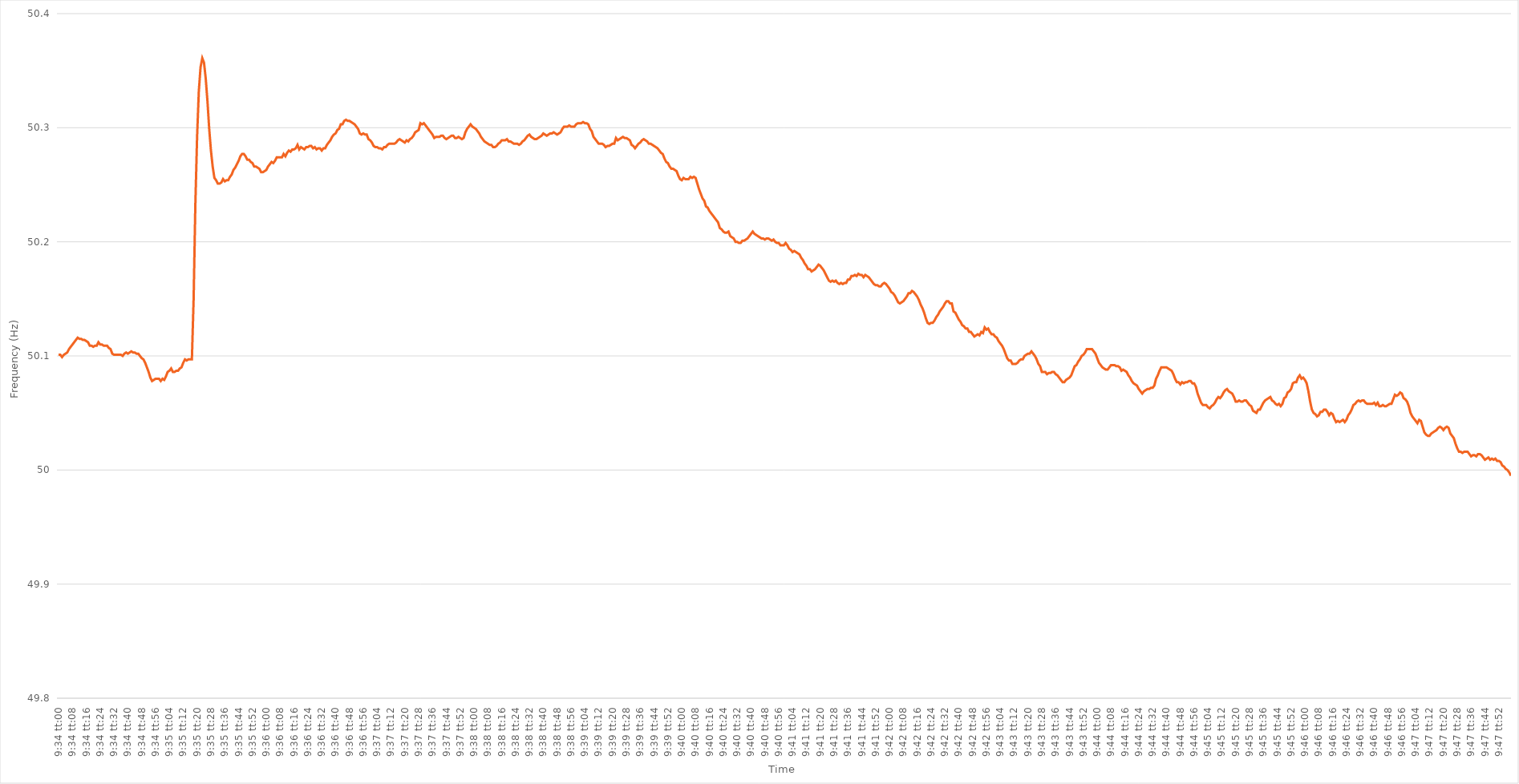
| Category | Series 0 |
|---|---|
| 0.3986111111111111 | 50.101 |
| 0.39862268518518523 | 50.101 |
| 0.39863425925925927 | 50.099 |
| 0.39864583333333337 | 50.101 |
| 0.3986574074074074 | 50.102 |
| 0.3986689814814815 | 50.103 |
| 0.39868055555555554 | 50.106 |
| 0.3986921296296296 | 50.108 |
| 0.3987037037037037 | 50.11 |
| 0.39871527777777777 | 50.112 |
| 0.39872685185185186 | 50.114 |
| 0.3987384259259259 | 50.116 |
| 0.39875 | 50.115 |
| 0.39876157407407403 | 50.115 |
| 0.3987731481481482 | 50.114 |
| 0.3987847222222222 | 50.114 |
| 0.3987962962962963 | 50.113 |
| 0.39880787037037035 | 50.112 |
| 0.39881944444444445 | 50.109 |
| 0.3988310185185185 | 50.109 |
| 0.39884259259259264 | 50.108 |
| 0.3988541666666667 | 50.109 |
| 0.39886574074074077 | 50.109 |
| 0.3988773148148148 | 50.112 |
| 0.3988888888888889 | 50.11 |
| 0.39890046296296294 | 50.11 |
| 0.398912037037037 | 50.109 |
| 0.39892361111111113 | 50.109 |
| 0.39893518518518517 | 50.109 |
| 0.39894675925925926 | 50.107 |
| 0.3989583333333333 | 50.106 |
| 0.3989699074074074 | 50.102 |
| 0.39898148148148144 | 50.101 |
| 0.3989930555555556 | 50.101 |
| 0.3990046296296296 | 50.101 |
| 0.3990162037037037 | 50.101 |
| 0.39902777777777776 | 50.101 |
| 0.39903935185185185 | 50.1 |
| 0.3990509259259259 | 50.102 |
| 0.39906250000000004 | 50.103 |
| 0.3990740740740741 | 50.102 |
| 0.3990856481481482 | 50.103 |
| 0.3990972222222222 | 50.104 |
| 0.3991087962962963 | 50.103 |
| 0.39912037037037035 | 50.103 |
| 0.3991319444444445 | 50.102 |
| 0.39914351851851854 | 50.102 |
| 0.3991550925925926 | 50.1 |
| 0.39916666666666667 | 50.098 |
| 0.3991782407407407 | 50.097 |
| 0.3991898148148148 | 50.094 |
| 0.39920138888888884 | 50.09 |
| 0.399212962962963 | 50.086 |
| 0.39922453703703703 | 50.081 |
| 0.3992361111111111 | 50.078 |
| 0.39924768518518516 | 50.079 |
| 0.39925925925925926 | 50.08 |
| 0.3992708333333333 | 50.08 |
| 0.39928240740740745 | 50.08 |
| 0.3992939814814815 | 50.078 |
| 0.3993055555555556 | 50.08 |
| 0.3993171296296296 | 50.079 |
| 0.3993287037037037 | 50.082 |
| 0.39934027777777775 | 50.086 |
| 0.3993518518518519 | 50.087 |
| 0.39936342592592594 | 50.089 |
| 0.39937500000000004 | 50.086 |
| 0.3993865740740741 | 50.086 |
| 0.3993981481481481 | 50.087 |
| 0.3994097222222222 | 50.087 |
| 0.39942129629629625 | 50.089 |
| 0.3994328703703704 | 50.09 |
| 0.39944444444444444 | 50.094 |
| 0.39945601851851853 | 50.097 |
| 0.39946759259259257 | 50.096 |
| 0.39947916666666666 | 50.097 |
| 0.3994907407407407 | 50.097 |
| 0.39950231481481485 | 50.097 |
| 0.3995138888888889 | 50.15 |
| 0.399525462962963 | 50.233 |
| 0.399537037037037 | 50.292 |
| 0.3995486111111111 | 50.332 |
| 0.39956018518518516 | 50.353 |
| 0.3995717592592593 | 50.361 |
| 0.39958333333333335 | 50.357 |
| 0.39959490740740744 | 50.343 |
| 0.3996064814814815 | 50.323 |
| 0.3996180555555556 | 50.299 |
| 0.3996296296296296 | 50.28 |
| 0.39964120370370365 | 50.266 |
| 0.3996527777777778 | 50.256 |
| 0.39966435185185184 | 50.254 |
| 0.39967592592592593 | 50.251 |
| 0.3996875 | 50.251 |
| 0.39969907407407407 | 50.252 |
| 0.3997106481481481 | 50.255 |
| 0.39972222222222226 | 50.253 |
| 0.3997337962962963 | 50.254 |
| 0.3997453703703704 | 50.254 |
| 0.39975694444444443 | 50.257 |
| 0.3997685185185185 | 50.259 |
| 0.39978009259259256 | 50.263 |
| 0.3997916666666667 | 50.265 |
| 0.39980324074074075 | 50.268 |
| 0.39981481481481485 | 50.271 |
| 0.3998263888888889 | 50.275 |
| 0.399837962962963 | 50.277 |
| 0.399849537037037 | 50.277 |
| 0.39986111111111106 | 50.275 |
| 0.3998726851851852 | 50.272 |
| 0.39988425925925924 | 50.272 |
| 0.39989583333333334 | 50.27 |
| 0.3999074074074074 | 50.269 |
| 0.3999189814814815 | 50.266 |
| 0.3999305555555555 | 50.266 |
| 0.39994212962962966 | 50.265 |
| 0.3999537037037037 | 50.264 |
| 0.3999652777777778 | 50.261 |
| 0.39997685185185183 | 50.261 |
| 0.39998842592592593 | 50.262 |
| 0.39999999999999997 | 50.263 |
| 0.4000115740740741 | 50.266 |
| 0.40002314814814816 | 50.268 |
| 0.40003472222222225 | 50.27 |
| 0.4000462962962963 | 50.269 |
| 0.4000578703703704 | 50.271 |
| 0.4000694444444444 | 50.274 |
| 0.40008101851851857 | 50.274 |
| 0.4000925925925926 | 50.274 |
| 0.40010416666666665 | 50.274 |
| 0.40011574074074074 | 50.277 |
| 0.4001273148148148 | 50.275 |
| 0.4001388888888889 | 50.278 |
| 0.4001504629629629 | 50.28 |
| 0.40016203703703707 | 50.279 |
| 0.4001736111111111 | 50.281 |
| 0.4001851851851852 | 50.281 |
| 0.40019675925925924 | 50.282 |
| 0.40020833333333333 | 50.285 |
| 0.40021990740740737 | 50.281 |
| 0.4002314814814815 | 50.283 |
| 0.40024305555555556 | 50.282 |
| 0.40025462962962965 | 50.281 |
| 0.4002662037037037 | 50.283 |
| 0.4002777777777778 | 50.283 |
| 0.4002893518518518 | 50.284 |
| 0.400300925925926 | 50.284 |
| 0.4003125 | 50.282 |
| 0.4003240740740741 | 50.283 |
| 0.40033564814814815 | 50.281 |
| 0.4003472222222222 | 50.282 |
| 0.4003587962962963 | 50.282 |
| 0.4003703703703703 | 50.28 |
| 0.40038194444444447 | 50.282 |
| 0.4003935185185185 | 50.282 |
| 0.4004050925925926 | 50.285 |
| 0.40041666666666664 | 50.287 |
| 0.40042824074074074 | 50.289 |
| 0.4004398148148148 | 50.292 |
| 0.4004513888888889 | 50.294 |
| 0.40046296296296297 | 50.295 |
| 0.40047453703703706 | 50.298 |
| 0.4004861111111111 | 50.299 |
| 0.4004976851851852 | 50.303 |
| 0.40050925925925923 | 50.303 |
| 0.4005208333333334 | 50.306 |
| 0.4005324074074074 | 50.307 |
| 0.4005439814814815 | 50.306 |
| 0.40055555555555555 | 50.306 |
| 0.40056712962962965 | 50.305 |
| 0.4005787037037037 | 50.304 |
| 0.4005902777777777 | 50.303 |
| 0.4006018518518519 | 50.301 |
| 0.4006134259259259 | 50.299 |
| 0.400625 | 50.295 |
| 0.40063657407407405 | 50.294 |
| 0.40064814814814814 | 50.295 |
| 0.4006597222222222 | 50.294 |
| 0.40067129629629633 | 50.294 |
| 0.40068287037037037 | 50.29 |
| 0.40069444444444446 | 50.289 |
| 0.4007060185185185 | 50.287 |
| 0.4007175925925926 | 50.284 |
| 0.40072916666666664 | 50.283 |
| 0.4007407407407408 | 50.283 |
| 0.4007523148148148 | 50.282 |
| 0.4007638888888889 | 50.282 |
| 0.40077546296296296 | 50.281 |
| 0.40078703703703705 | 50.283 |
| 0.4007986111111111 | 50.283 |
| 0.40081018518518513 | 50.285 |
| 0.4008217592592593 | 50.286 |
| 0.4008333333333333 | 50.286 |
| 0.4008449074074074 | 50.286 |
| 0.40085648148148145 | 50.286 |
| 0.40086805555555555 | 50.287 |
| 0.4008796296296296 | 50.289 |
| 0.40089120370370374 | 50.29 |
| 0.4009027777777778 | 50.289 |
| 0.40091435185185187 | 50.288 |
| 0.4009259259259259 | 50.287 |
| 0.4009375 | 50.289 |
| 0.40094907407407404 | 50.288 |
| 0.4009606481481482 | 50.29 |
| 0.40097222222222223 | 50.291 |
| 0.4009837962962963 | 50.293 |
| 0.40099537037037036 | 50.296 |
| 0.40100694444444446 | 50.297 |
| 0.4010185185185185 | 50.298 |
| 0.40103009259259265 | 50.304 |
| 0.4010416666666667 | 50.303 |
| 0.4010532407407407 | 50.304 |
| 0.4010648148148148 | 50.302 |
| 0.40107638888888886 | 50.3 |
| 0.40108796296296295 | 50.298 |
| 0.401099537037037 | 50.296 |
| 0.40111111111111114 | 50.294 |
| 0.4011226851851852 | 50.291 |
| 0.4011342592592593 | 50.292 |
| 0.4011458333333333 | 50.292 |
| 0.4011574074074074 | 50.292 |
| 0.40116898148148145 | 50.293 |
| 0.4011805555555556 | 50.293 |
| 0.40119212962962963 | 50.291 |
| 0.40120370370370373 | 50.29 |
| 0.40121527777777777 | 50.291 |
| 0.40122685185185186 | 50.292 |
| 0.4012384259259259 | 50.293 |
| 0.40125000000000005 | 50.293 |
| 0.4012615740740741 | 50.291 |
| 0.4012731481481482 | 50.291 |
| 0.4012847222222222 | 50.292 |
| 0.40129629629629626 | 50.291 |
| 0.40130787037037036 | 50.29 |
| 0.4013194444444444 | 50.291 |
| 0.40133101851851855 | 50.296 |
| 0.4013425925925926 | 50.299 |
| 0.4013541666666667 | 50.301 |
| 0.4013657407407407 | 50.303 |
| 0.4013773148148148 | 50.301 |
| 0.40138888888888885 | 50.3 |
| 0.401400462962963 | 50.299 |
| 0.40141203703703704 | 50.297 |
| 0.40142361111111113 | 50.295 |
| 0.4014351851851852 | 50.292 |
| 0.40144675925925927 | 50.29 |
| 0.4014583333333333 | 50.288 |
| 0.40146990740740746 | 50.287 |
| 0.4014814814814815 | 50.286 |
| 0.4014930555555556 | 50.285 |
| 0.40150462962962963 | 50.285 |
| 0.40151620370370367 | 50.283 |
| 0.40152777777777776 | 50.283 |
| 0.4015393518518518 | 50.284 |
| 0.40155092592592595 | 50.286 |
| 0.4015625 | 50.287 |
| 0.4015740740740741 | 50.289 |
| 0.4015856481481481 | 50.289 |
| 0.4015972222222222 | 50.289 |
| 0.40160879629629626 | 50.29 |
| 0.4016203703703704 | 50.288 |
| 0.40163194444444444 | 50.288 |
| 0.40164351851851854 | 50.287 |
| 0.4016550925925926 | 50.286 |
| 0.40166666666666667 | 50.286 |
| 0.4016782407407407 | 50.286 |
| 0.40168981481481486 | 50.285 |
| 0.4017013888888889 | 50.286 |
| 0.401712962962963 | 50.288 |
| 0.40172453703703703 | 50.289 |
| 0.4017361111111111 | 50.291 |
| 0.40174768518518517 | 50.293 |
| 0.4017592592592592 | 50.294 |
| 0.40177083333333335 | 50.292 |
| 0.4017824074074074 | 50.291 |
| 0.4017939814814815 | 50.29 |
| 0.4018055555555555 | 50.29 |
| 0.4018171296296296 | 50.291 |
| 0.40182870370370366 | 50.292 |
| 0.4018402777777778 | 50.293 |
| 0.40185185185185185 | 50.295 |
| 0.40186342592592594 | 50.294 |
| 0.401875 | 50.293 |
| 0.4018865740740741 | 50.294 |
| 0.4018981481481481 | 50.295 |
| 0.40190972222222227 | 50.295 |
| 0.4019212962962963 | 50.296 |
| 0.4019328703703704 | 50.295 |
| 0.40194444444444444 | 50.294 |
| 0.40195601851851853 | 50.295 |
| 0.40196759259259257 | 50.296 |
| 0.4019791666666667 | 50.299 |
| 0.40199074074074076 | 50.301 |
| 0.4020023148148148 | 50.301 |
| 0.4020138888888889 | 50.301 |
| 0.40202546296296293 | 50.302 |
| 0.402037037037037 | 50.301 |
| 0.40204861111111106 | 50.301 |
| 0.4020601851851852 | 50.301 |
| 0.40207175925925925 | 50.303 |
| 0.40208333333333335 | 50.304 |
| 0.4020949074074074 | 50.304 |
| 0.4021064814814815 | 50.304 |
| 0.4021180555555555 | 50.305 |
| 0.40212962962962967 | 50.304 |
| 0.4021412037037037 | 50.304 |
| 0.4021527777777778 | 50.303 |
| 0.40216435185185184 | 50.299 |
| 0.40217592592592594 | 50.297 |
| 0.4021875 | 50.292 |
| 0.4021990740740741 | 50.29 |
| 0.40221064814814816 | 50.288 |
| 0.40222222222222226 | 50.286 |
| 0.4022337962962963 | 50.286 |
| 0.40224537037037034 | 50.286 |
| 0.40225694444444443 | 50.285 |
| 0.40226851851851847 | 50.283 |
| 0.4022800925925926 | 50.284 |
| 0.40229166666666666 | 50.284 |
| 0.40230324074074075 | 50.285 |
| 0.4023148148148148 | 50.286 |
| 0.4023263888888889 | 50.286 |
| 0.4023379629629629 | 50.291 |
| 0.4023495370370371 | 50.289 |
| 0.4023611111111111 | 50.29 |
| 0.4023726851851852 | 50.291 |
| 0.40238425925925925 | 50.292 |
| 0.40239583333333334 | 50.291 |
| 0.4024074074074074 | 50.291 |
| 0.40241898148148153 | 50.29 |
| 0.40243055555555557 | 50.289 |
| 0.40244212962962966 | 50.285 |
| 0.4024537037037037 | 50.284 |
| 0.40246527777777774 | 50.282 |
| 0.40247685185185184 | 50.284 |
| 0.4024884259259259 | 50.286 |
| 0.4025 | 50.287 |
| 0.40251157407407406 | 50.289 |
| 0.40252314814814816 | 50.29 |
| 0.4025347222222222 | 50.289 |
| 0.4025462962962963 | 50.288 |
| 0.40255787037037033 | 50.286 |
| 0.4025694444444445 | 50.286 |
| 0.4025810185185185 | 50.285 |
| 0.4025925925925926 | 50.284 |
| 0.40260416666666665 | 50.283 |
| 0.40261574074074075 | 50.282 |
| 0.4026273148148148 | 50.28 |
| 0.40263888888888894 | 50.278 |
| 0.402650462962963 | 50.277 |
| 0.40266203703703707 | 50.273 |
| 0.4026736111111111 | 50.27 |
| 0.4026851851851852 | 50.269 |
| 0.40269675925925924 | 50.266 |
| 0.4027083333333333 | 50.264 |
| 0.40271990740740743 | 50.264 |
| 0.40273148148148147 | 50.263 |
| 0.40274305555555556 | 50.262 |
| 0.4027546296296296 | 50.258 |
| 0.4027662037037037 | 50.255 |
| 0.40277777777777773 | 50.254 |
| 0.4027893518518519 | 50.256 |
| 0.4028009259259259 | 50.255 |
| 0.4028125 | 50.255 |
| 0.40282407407407406 | 50.255 |
| 0.40283564814814815 | 50.257 |
| 0.4028472222222222 | 50.256 |
| 0.40285879629629634 | 50.257 |
| 0.4028703703703704 | 50.256 |
| 0.4028819444444445 | 50.251 |
| 0.4028935185185185 | 50.246 |
| 0.4029050925925926 | 50.242 |
| 0.40291666666666665 | 50.238 |
| 0.4029282407407408 | 50.236 |
| 0.40293981481481483 | 50.231 |
| 0.4029513888888889 | 50.23 |
| 0.40296296296296297 | 50.227 |
| 0.402974537037037 | 50.225 |
| 0.4029861111111111 | 50.223 |
| 0.40299768518518514 | 50.221 |
| 0.4030092592592593 | 50.219 |
| 0.40302083333333333 | 50.217 |
| 0.4030324074074074 | 50.212 |
| 0.40304398148148146 | 50.211 |
| 0.40305555555555556 | 50.209 |
| 0.4030671296296296 | 50.208 |
| 0.40307870370370374 | 50.208 |
| 0.4030902777777778 | 50.209 |
| 0.4031018518518519 | 50.205 |
| 0.4031134259259259 | 50.204 |
| 0.403125 | 50.203 |
| 0.40313657407407405 | 50.2 |
| 0.4031481481481482 | 50.2 |
| 0.40315972222222224 | 50.199 |
| 0.40317129629629633 | 50.199 |
| 0.40318287037037037 | 50.201 |
| 0.4031944444444444 | 50.201 |
| 0.4032060185185185 | 50.202 |
| 0.40321759259259254 | 50.203 |
| 0.4032291666666667 | 50.205 |
| 0.40324074074074073 | 50.207 |
| 0.4032523148148148 | 50.209 |
| 0.40326388888888887 | 50.207 |
| 0.40327546296296296 | 50.206 |
| 0.403287037037037 | 50.205 |
| 0.40329861111111115 | 50.204 |
| 0.4033101851851852 | 50.203 |
| 0.4033217592592593 | 50.203 |
| 0.4033333333333333 | 50.202 |
| 0.4033449074074074 | 50.203 |
| 0.40335648148148145 | 50.203 |
| 0.4033680555555556 | 50.202 |
| 0.40337962962962964 | 50.201 |
| 0.40339120370370374 | 50.202 |
| 0.4034027777777778 | 50.2 |
| 0.4034143518518518 | 50.199 |
| 0.4034259259259259 | 50.199 |
| 0.40343749999999995 | 50.197 |
| 0.4034490740740741 | 50.197 |
| 0.40346064814814814 | 50.197 |
| 0.40347222222222223 | 50.199 |
| 0.40348379629629627 | 50.197 |
| 0.40349537037037037 | 50.194 |
| 0.4035069444444444 | 50.193 |
| 0.40351851851851855 | 50.191 |
| 0.4035300925925926 | 50.192 |
| 0.4035416666666667 | 50.191 |
| 0.4035532407407407 | 50.19 |
| 0.4035648148148148 | 50.189 |
| 0.40357638888888886 | 50.186 |
| 0.403587962962963 | 50.184 |
| 0.40359953703703705 | 50.181 |
| 0.40361111111111114 | 50.179 |
| 0.4036226851851852 | 50.176 |
| 0.4036342592592593 | 50.176 |
| 0.4036458333333333 | 50.174 |
| 0.40365740740740735 | 50.175 |
| 0.4036689814814815 | 50.176 |
| 0.40368055555555554 | 50.178 |
| 0.40369212962962964 | 50.18 |
| 0.4037037037037037 | 50.179 |
| 0.40371527777777777 | 50.177 |
| 0.4037268518518518 | 50.175 |
| 0.40373842592592596 | 50.172 |
| 0.40375 | 50.169 |
| 0.4037615740740741 | 50.166 |
| 0.40377314814814813 | 50.165 |
| 0.4037847222222222 | 50.166 |
| 0.40379629629629626 | 50.165 |
| 0.4038078703703704 | 50.166 |
| 0.40381944444444445 | 50.164 |
| 0.40383101851851855 | 50.163 |
| 0.4038425925925926 | 50.164 |
| 0.4038541666666667 | 50.163 |
| 0.4038657407407407 | 50.164 |
| 0.40387731481481487 | 50.164 |
| 0.4038888888888889 | 50.167 |
| 0.40390046296296295 | 50.167 |
| 0.40391203703703704 | 50.17 |
| 0.4039236111111111 | 50.17 |
| 0.4039351851851852 | 50.171 |
| 0.4039467592592592 | 50.17 |
| 0.40395833333333336 | 50.172 |
| 0.4039699074074074 | 50.171 |
| 0.4039814814814815 | 50.171 |
| 0.40399305555555554 | 50.169 |
| 0.40400462962962963 | 50.171 |
| 0.40401620370370367 | 50.17 |
| 0.4040277777777778 | 50.169 |
| 0.40403935185185186 | 50.167 |
| 0.40405092592592595 | 50.165 |
| 0.4040625 | 50.163 |
| 0.4040740740740741 | 50.162 |
| 0.4040856481481481 | 50.162 |
| 0.4040972222222223 | 50.161 |
| 0.4041087962962963 | 50.161 |
| 0.40412037037037035 | 50.163 |
| 0.40413194444444445 | 50.164 |
| 0.4041435185185185 | 50.163 |
| 0.4041550925925926 | 50.161 |
| 0.4041666666666666 | 50.159 |
| 0.40417824074074077 | 50.156 |
| 0.4041898148148148 | 50.155 |
| 0.4042013888888889 | 50.153 |
| 0.40421296296296294 | 50.15 |
| 0.40422453703703703 | 50.147 |
| 0.4042361111111111 | 50.146 |
| 0.4042476851851852 | 50.147 |
| 0.40425925925925926 | 50.148 |
| 0.40427083333333336 | 50.15 |
| 0.4042824074074074 | 50.152 |
| 0.4042939814814815 | 50.155 |
| 0.40430555555555553 | 50.155 |
| 0.4043171296296297 | 50.157 |
| 0.4043287037037037 | 50.156 |
| 0.4043402777777778 | 50.154 |
| 0.40435185185185185 | 50.152 |
| 0.4043634259259259 | 50.149 |
| 0.404375 | 50.145 |
| 0.404386574074074 | 50.142 |
| 0.4043981481481482 | 50.138 |
| 0.4044097222222222 | 50.133 |
| 0.4044212962962963 | 50.129 |
| 0.40443287037037035 | 50.128 |
| 0.40444444444444444 | 50.129 |
| 0.4044560185185185 | 50.129 |
| 0.40446759259259263 | 50.131 |
| 0.40447916666666667 | 50.134 |
| 0.40449074074074076 | 50.136 |
| 0.4045023148148148 | 50.139 |
| 0.4045138888888889 | 50.141 |
| 0.40452546296296293 | 50.143 |
| 0.4045370370370371 | 50.146 |
| 0.4045486111111111 | 50.148 |
| 0.4045601851851852 | 50.148 |
| 0.40457175925925926 | 50.146 |
| 0.40458333333333335 | 50.146 |
| 0.4045949074074074 | 50.139 |
| 0.40460648148148143 | 50.138 |
| 0.4046180555555556 | 50.135 |
| 0.4046296296296296 | 50.132 |
| 0.4046412037037037 | 50.13 |
| 0.40465277777777775 | 50.127 |
| 0.40466435185185184 | 50.126 |
| 0.4046759259259259 | 50.124 |
| 0.40468750000000003 | 50.124 |
| 0.40469907407407407 | 50.121 |
| 0.40471064814814817 | 50.121 |
| 0.4047222222222222 | 50.119 |
| 0.4047337962962963 | 50.117 |
| 0.40474537037037034 | 50.118 |
| 0.4047569444444445 | 50.119 |
| 0.4047685185185185 | 50.118 |
| 0.4047800925925926 | 50.121 |
| 0.40479166666666666 | 50.12 |
| 0.40480324074074076 | 50.125 |
| 0.4048148148148148 | 50.123 |
| 0.40482638888888894 | 50.124 |
| 0.404837962962963 | 50.121 |
| 0.404849537037037 | 50.119 |
| 0.4048611111111111 | 50.119 |
| 0.40487268518518515 | 50.117 |
| 0.40488425925925925 | 50.116 |
| 0.4048958333333333 | 50.113 |
| 0.40490740740740744 | 50.111 |
| 0.4049189814814815 | 50.109 |
| 0.40493055555555557 | 50.106 |
| 0.4049421296296296 | 50.102 |
| 0.4049537037037037 | 50.098 |
| 0.40496527777777774 | 50.096 |
| 0.4049768518518519 | 50.096 |
| 0.40498842592592593 | 50.093 |
| 0.405 | 50.093 |
| 0.40501157407407407 | 50.093 |
| 0.40502314814814816 | 50.094 |
| 0.4050347222222222 | 50.096 |
| 0.40504629629629635 | 50.097 |
| 0.4050578703703704 | 50.097 |
| 0.4050694444444444 | 50.1 |
| 0.4050810185185185 | 50.101 |
| 0.40509259259259256 | 50.102 |
| 0.40510416666666665 | 50.102 |
| 0.4051157407407407 | 50.104 |
| 0.40512731481481484 | 50.102 |
| 0.4051388888888889 | 50.1 |
| 0.405150462962963 | 50.097 |
| 0.405162037037037 | 50.093 |
| 0.4051736111111111 | 50.091 |
| 0.40518518518518515 | 50.086 |
| 0.4051967592592593 | 50.086 |
| 0.40520833333333334 | 50.086 |
| 0.40521990740740743 | 50.084 |
| 0.40523148148148147 | 50.085 |
| 0.40524305555555556 | 50.085 |
| 0.4052546296296296 | 50.086 |
| 0.40526620370370375 | 50.086 |
| 0.4052777777777778 | 50.084 |
| 0.4052893518518519 | 50.083 |
| 0.4053009259259259 | 50.081 |
| 0.40531249999999996 | 50.079 |
| 0.40532407407407406 | 50.077 |
| 0.4053356481481481 | 50.077 |
| 0.40534722222222225 | 50.079 |
| 0.4053587962962963 | 50.08 |
| 0.4053703703703704 | 50.081 |
| 0.4053819444444444 | 50.083 |
| 0.4053935185185185 | 50.087 |
| 0.40540509259259255 | 50.091 |
| 0.4054166666666667 | 50.092 |
| 0.40542824074074074 | 50.095 |
| 0.40543981481481484 | 50.097 |
| 0.4054513888888889 | 50.1 |
| 0.40546296296296297 | 50.101 |
| 0.405474537037037 | 50.103 |
| 0.40548611111111116 | 50.106 |
| 0.4054976851851852 | 50.106 |
| 0.4055092592592593 | 50.106 |
| 0.40552083333333333 | 50.106 |
| 0.4055324074074074 | 50.104 |
| 0.40554398148148146 | 50.102 |
| 0.4055555555555555 | 50.098 |
| 0.40556712962962965 | 50.094 |
| 0.4055787037037037 | 50.092 |
| 0.4055902777777778 | 50.09 |
| 0.4056018518518518 | 50.089 |
| 0.4056134259259259 | 50.088 |
| 0.40562499999999996 | 50.088 |
| 0.4056365740740741 | 50.09 |
| 0.40564814814814815 | 50.092 |
| 0.40565972222222224 | 50.092 |
| 0.4056712962962963 | 50.092 |
| 0.4056828703703704 | 50.091 |
| 0.4056944444444444 | 50.091 |
| 0.40570601851851856 | 50.09 |
| 0.4057175925925926 | 50.087 |
| 0.4057291666666667 | 50.088 |
| 0.40574074074074074 | 50.087 |
| 0.40575231481481483 | 50.086 |
| 0.40576388888888887 | 50.083 |
| 0.405775462962963 | 50.081 |
| 0.40578703703703706 | 50.078 |
| 0.4057986111111111 | 50.076 |
| 0.4058101851851852 | 50.075 |
| 0.40582175925925923 | 50.074 |
| 0.4058333333333333 | 50.071 |
| 0.40584490740740736 | 50.069 |
| 0.4058564814814815 | 50.067 |
| 0.40586805555555555 | 50.069 |
| 0.40587962962962965 | 50.07 |
| 0.4058912037037037 | 50.071 |
| 0.4059027777777778 | 50.071 |
| 0.4059143518518518 | 50.072 |
| 0.40592592592592597 | 50.072 |
| 0.4059375 | 50.074 |
| 0.4059490740740741 | 50.08 |
| 0.40596064814814814 | 50.083 |
| 0.40597222222222223 | 50.087 |
| 0.4059837962962963 | 50.09 |
| 0.4059953703703704 | 50.09 |
| 0.40600694444444446 | 50.09 |
| 0.4060185185185185 | 50.09 |
| 0.4060300925925926 | 50.089 |
| 0.40604166666666663 | 50.088 |
| 0.40605324074074073 | 50.087 |
| 0.40606481481481477 | 50.084 |
| 0.4060763888888889 | 50.08 |
| 0.40608796296296296 | 50.077 |
| 0.40609953703703705 | 50.077 |
| 0.4061111111111111 | 50.075 |
| 0.4061226851851852 | 50.077 |
| 0.4061342592592592 | 50.076 |
| 0.4061458333333334 | 50.077 |
| 0.4061574074074074 | 50.077 |
| 0.4061689814814815 | 50.078 |
| 0.40618055555555554 | 50.078 |
| 0.40619212962962964 | 50.076 |
| 0.4062037037037037 | 50.076 |
| 0.40621527777777783 | 50.073 |
| 0.40622685185185187 | 50.067 |
| 0.40623842592592596 | 50.063 |
| 0.40625 | 50.059 |
| 0.40626157407407404 | 50.057 |
| 0.40627314814814813 | 50.057 |
| 0.40628472222222217 | 50.057 |
| 0.4062962962962963 | 50.055 |
| 0.40630787037037036 | 50.054 |
| 0.40631944444444446 | 50.056 |
| 0.4063310185185185 | 50.057 |
| 0.4063425925925926 | 50.059 |
| 0.4063541666666666 | 50.062 |
| 0.4063657407407408 | 50.064 |
| 0.4063773148148148 | 50.063 |
| 0.4063888888888889 | 50.065 |
| 0.40640046296296295 | 50.068 |
| 0.40641203703703704 | 50.07 |
| 0.4064236111111111 | 50.071 |
| 0.40643518518518523 | 50.069 |
| 0.40644675925925927 | 50.068 |
| 0.40645833333333337 | 50.067 |
| 0.4064699074074074 | 50.064 |
| 0.4064814814814815 | 50.06 |
| 0.40649305555555554 | 50.06 |
| 0.4065046296296296 | 50.061 |
| 0.4065162037037037 | 50.06 |
| 0.40652777777777777 | 50.06 |
| 0.40653935185185186 | 50.061 |
| 0.4065509259259259 | 50.061 |
| 0.4065625 | 50.059 |
| 0.40657407407407403 | 50.057 |
| 0.4065856481481482 | 50.056 |
| 0.4065972222222222 | 50.052 |
| 0.4066087962962963 | 50.051 |
| 0.40662037037037035 | 50.05 |
| 0.40663194444444445 | 50.053 |
| 0.4066435185185185 | 50.053 |
| 0.40665509259259264 | 50.056 |
| 0.4066666666666667 | 50.059 |
| 0.40667824074074077 | 50.061 |
| 0.4066898148148148 | 50.062 |
| 0.4067013888888889 | 50.063 |
| 0.40671296296296294 | 50.064 |
| 0.406724537037037 | 50.061 |
| 0.40673611111111113 | 50.06 |
| 0.40674768518518517 | 50.058 |
| 0.40675925925925926 | 50.057 |
| 0.4067708333333333 | 50.058 |
| 0.4067824074074074 | 50.056 |
| 0.40679398148148144 | 50.058 |
| 0.4068055555555556 | 50.063 |
| 0.4068171296296296 | 50.064 |
| 0.4068287037037037 | 50.068 |
| 0.40684027777777776 | 50.069 |
| 0.40685185185185185 | 50.071 |
| 0.4068634259259259 | 50.076 |
| 0.40687500000000004 | 50.077 |
| 0.4068865740740741 | 50.077 |
| 0.4068981481481482 | 50.081 |
| 0.4069097222222222 | 50.083 |
| 0.4069212962962963 | 50.08 |
| 0.40693287037037035 | 50.081 |
| 0.4069444444444445 | 50.079 |
| 0.40695601851851854 | 50.076 |
| 0.4069675925925926 | 50.069 |
| 0.40697916666666667 | 50.06 |
| 0.4069907407407407 | 50.053 |
| 0.4070023148148148 | 50.05 |
| 0.40701388888888884 | 50.049 |
| 0.407025462962963 | 50.047 |
| 0.40703703703703703 | 50.048 |
| 0.4070486111111111 | 50.051 |
| 0.40706018518518516 | 50.051 |
| 0.40707175925925926 | 50.053 |
| 0.4070833333333333 | 50.053 |
| 0.40709490740740745 | 50.051 |
| 0.4071064814814815 | 50.048 |
| 0.4071180555555556 | 50.05 |
| 0.4071296296296296 | 50.049 |
| 0.4071412037037037 | 50.045 |
| 0.40715277777777775 | 50.042 |
| 0.4071643518518519 | 50.043 |
| 0.40717592592592594 | 50.042 |
| 0.40718750000000004 | 50.043 |
| 0.4071990740740741 | 50.044 |
| 0.4072106481481481 | 50.042 |
| 0.4072222222222222 | 50.044 |
| 0.40723379629629625 | 50.048 |
| 0.4072453703703704 | 50.05 |
| 0.40725694444444444 | 50.053 |
| 0.40726851851851853 | 50.057 |
| 0.40728009259259257 | 50.058 |
| 0.40729166666666666 | 50.06 |
| 0.4073032407407407 | 50.061 |
| 0.40731481481481485 | 50.06 |
| 0.4073263888888889 | 50.061 |
| 0.407337962962963 | 50.061 |
| 0.407349537037037 | 50.059 |
| 0.4073611111111111 | 50.058 |
| 0.40737268518518516 | 50.058 |
| 0.4073842592592593 | 50.058 |
| 0.40739583333333335 | 50.058 |
| 0.40740740740740744 | 50.059 |
| 0.4074189814814815 | 50.057 |
| 0.4074305555555556 | 50.059 |
| 0.4074421296296296 | 50.056 |
| 0.40745370370370365 | 50.056 |
| 0.4074652777777778 | 50.057 |
| 0.40747685185185184 | 50.056 |
| 0.40748842592592593 | 50.056 |
| 0.4075 | 50.057 |
| 0.40751157407407407 | 50.058 |
| 0.4075231481481481 | 50.058 |
| 0.40753472222222226 | 50.062 |
| 0.4075462962962963 | 50.066 |
| 0.4075578703703704 | 50.065 |
| 0.40756944444444443 | 50.066 |
| 0.4075810185185185 | 50.068 |
| 0.40759259259259256 | 50.067 |
| 0.4076041666666667 | 50.063 |
| 0.40761574074074075 | 50.062 |
| 0.40762731481481485 | 50.06 |
| 0.4076388888888889 | 50.056 |
| 0.407650462962963 | 50.05 |
| 0.407662037037037 | 50.047 |
| 0.40767361111111106 | 50.045 |
| 0.4076851851851852 | 50.043 |
| 0.40769675925925924 | 50.041 |
| 0.40770833333333334 | 50.044 |
| 0.4077199074074074 | 50.043 |
| 0.4077314814814815 | 50.038 |
| 0.4077430555555555 | 50.033 |
| 0.40775462962962966 | 50.031 |
| 0.4077662037037037 | 50.03 |
| 0.4077777777777778 | 50.03 |
| 0.40778935185185183 | 50.032 |
| 0.40780092592592593 | 50.033 |
| 0.40781249999999997 | 50.034 |
| 0.4078240740740741 | 50.035 |
| 0.40783564814814816 | 50.037 |
| 0.40784722222222225 | 50.038 |
| 0.4078587962962963 | 50.037 |
| 0.4078703703703704 | 50.035 |
| 0.4078819444444444 | 50.037 |
| 0.40789351851851857 | 50.038 |
| 0.4079050925925926 | 50.037 |
| 0.40791666666666665 | 50.032 |
| 0.40792824074074074 | 50.03 |
| 0.4079398148148148 | 50.028 |
| 0.4079513888888889 | 50.023 |
| 0.4079629629629629 | 50.019 |
| 0.40797453703703707 | 50.016 |
| 0.4079861111111111 | 50.016 |
| 0.4079976851851852 | 50.015 |
| 0.40800925925925924 | 50.016 |
| 0.40802083333333333 | 50.016 |
| 0.40803240740740737 | 50.016 |
| 0.4080439814814815 | 50.014 |
| 0.40805555555555556 | 50.012 |
| 0.40806712962962965 | 50.013 |
| 0.4080787037037037 | 50.013 |
| 0.4080902777777778 | 50.012 |
| 0.4081018518518518 | 50.014 |
| 0.408113425925926 | 50.014 |
| 0.408125 | 50.013 |
| 0.4081365740740741 | 50.011 |
| 0.40814814814814815 | 50.009 |
| 0.4081597222222222 | 50.01 |
| 0.4081712962962963 | 50.011 |
| 0.4081828703703703 | 50.009 |
| 0.40819444444444447 | 50.01 |
| 0.4082060185185185 | 50.009 |
| 0.4082175925925926 | 50.01 |
| 0.40822916666666664 | 50.008 |
| 0.40824074074074074 | 50.008 |
| 0.4082523148148148 | 50.007 |
| 0.4082638888888889 | 50.004 |
| 0.40827546296296297 | 50.003 |
| 0.40828703703703706 | 50.001 |
| 0.4082986111111111 | 50 |
| 0.4083101851851852 | 49.998 |
| 0.40832175925925923 | 49.995 |